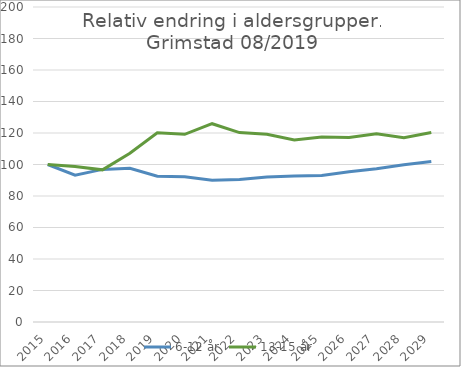
| Category | 6-12 år | 13-15 år |
|---|---|---|
| 2015.0 | 100 | 100 |
| 2016.0 | 93.255 | 98.775 |
| 2017.0 | 96.885 | 96.596 |
| 2018.0 | 97.656 | 107.148 |
| 2019.0 | 92.509 | 120.144 |
| 2020.0 | 92.195 | 119.179 |
| 2021.0 | 90.027 | 125.895 |
| 2022.0 | 90.506 | 120.282 |
| 2023.0 | 92.122 | 119.235 |
| 2024.0 | 92.736 | 115.608 |
| 2025.0 | 92.999 | 117.4 |
| 2026.0 | 95.398 | 117.105 |
| 2027.0 | 97.265 | 119.514 |
| 2028.0 | 99.831 | 117.024 |
| 2029.0 | 101.924 | 120.359 |